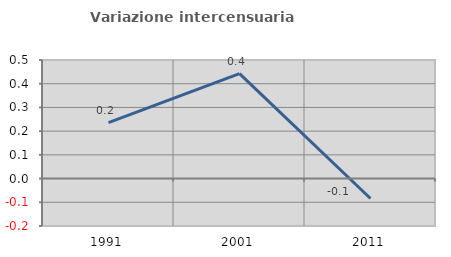
| Category | Variazione intercensuaria annua |
|---|---|
| 1991.0 | 0.236 |
| 2001.0 | 0.442 |
| 2011.0 | -0.084 |